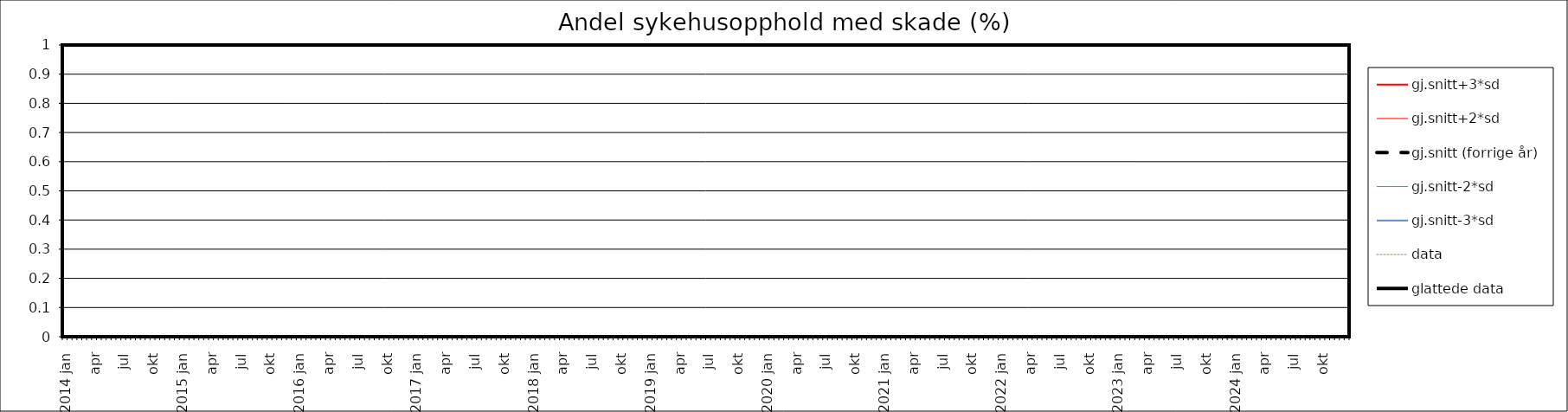
| Category | gj.snitt+3*sd | gj.snitt+2*sd | gj.snitt (forrige år) | gj.snitt-2*sd | gj.snitt-3*sd | data | glattede data |
|---|---|---|---|---|---|---|---|
| 2014 jan | 0 | 0 | 0 | 0 | 0 | 0 | 0 |
|  | 0 | 0 | 0 | 0 | 0 | 0 | 0 |
| feb | 0 | 0 | 0 | 0 | 0 | 0 | 0 |
|  | 0 | 0 | 0 | 0 | 0 | 0 | 0 |
| mar | 0 | 0 | 0 | 0 | 0 | 0 | 0 |
|  | 0 | 0 | 0 | 0 | 0 | 0 | 0 |
| apr | 0 | 0 | 0 | 0 | 0 | 0 | 0 |
|  | 0 | 0 | 0 | 0 | 0 | 0 | 0 |
| mai | 0 | 0 | 0 | 0 | 0 | 0 | 0 |
|  | 0 | 0 | 0 | 0 | 0 | 0 | 0 |
| jun | 0 | 0 | 0 | 0 | 0 | 0 | 0 |
|  | 0 | 0 | 0 | 0 | 0 | 0 | 0 |
| jul | 0 | 0 | 0 | 0 | 0 | 0 | 0 |
|  | 0 | 0 | 0 | 0 | 0 | 0 | 0 |
| aug | 0 | 0 | 0 | 0 | 0 | 0 | 0 |
|  | 0 | 0 | 0 | 0 | 0 | 0 | 0 |
| sep | 0 | 0 | 0 | 0 | 0 | 0 | 0 |
|  | 0 | 0 | 0 | 0 | 0 | 0 | 0 |
| okt | 0 | 0 | 0 | 0 | 0 | 0 | 0 |
|  | 0 | 0 | 0 | 0 | 0 | 0 | 0 |
| nov | 0 | 0 | 0 | 0 | 0 | 0 | 0 |
|  | 0 | 0 | 0 | 0 | 0 | 0 | 0 |
| des | 0 | 0 | 0 | 0 | 0 | 0 | 0 |
|  | 0 | 0 | 0 | 0 | 0 | 0 | 0 |
| 2015 jan | 0 | 0 | 0 | 0 | 0 | 0 | 0 |
|  | 0 | 0 | 0 | 0 | 0 | 0 | 0 |
| feb | 0 | 0 | 0 | 0 | 0 | 0 | 0 |
|  | 0 | 0 | 0 | 0 | 0 | 0 | 0 |
| mar | 0 | 0 | 0 | 0 | 0 | 0 | 0 |
|  | 0 | 0 | 0 | 0 | 0 | 0 | 0 |
| apr | 0 | 0 | 0 | 0 | 0 | 0 | 0 |
|  | 0 | 0 | 0 | 0 | 0 | 0 | 0 |
| mai | 0 | 0 | 0 | 0 | 0 | 0 | 0 |
|  | 0 | 0 | 0 | 0 | 0 | 0 | 0 |
| jun | 0 | 0 | 0 | 0 | 0 | 0 | 0 |
|  | 0 | 0 | 0 | 0 | 0 | 0 | 0 |
| jul | 0 | 0 | 0 | 0 | 0 | 0 | 0 |
|  | 0 | 0 | 0 | 0 | 0 | 0 | 0 |
| aug | 0 | 0 | 0 | 0 | 0 | 0 | 0 |
|  | 0 | 0 | 0 | 0 | 0 | 0 | 0 |
| sep | 0 | 0 | 0 | 0 | 0 | 0 | 0 |
|  | 0 | 0 | 0 | 0 | 0 | 0 | 0 |
| okt | 0 | 0 | 0 | 0 | 0 | 0 | 0 |
|  | 0 | 0 | 0 | 0 | 0 | 0 | 0 |
| nov | 0 | 0 | 0 | 0 | 0 | 0 | 0 |
|  | 0 | 0 | 0 | 0 | 0 | 0 | 0 |
| des | 0 | 0 | 0 | 0 | 0 | 0 | 0 |
|  | 0 | 0 | 0 | 0 | 0 | 0 | 0 |
| 2016 jan | 0 | 0 | 0 | 0 | 0 | 0 | 0 |
|  | 0 | 0 | 0 | 0 | 0 | 0 | 0 |
| feb | 0 | 0 | 0 | 0 | 0 | 0 | 0 |
|  | 0 | 0 | 0 | 0 | 0 | 0 | 0 |
| mar | 0 | 0 | 0 | 0 | 0 | 0 | 0 |
|  | 0 | 0 | 0 | 0 | 0 | 0 | 0 |
| apr | 0 | 0 | 0 | 0 | 0 | 0 | 0 |
|  | 0 | 0 | 0 | 0 | 0 | 0 | 0 |
| mai | 0 | 0 | 0 | 0 | 0 | 0 | 0 |
|  | 0 | 0 | 0 | 0 | 0 | 0 | 0 |
| jun | 0 | 0 | 0 | 0 | 0 | 0 | 0 |
|  | 0 | 0 | 0 | 0 | 0 | 0 | 0 |
| jul | 0 | 0 | 0 | 0 | 0 | 0 | 0 |
|  | 0 | 0 | 0 | 0 | 0 | 0 | 0 |
| aug | 0 | 0 | 0 | 0 | 0 | 0 | 0 |
|  | 0 | 0 | 0 | 0 | 0 | 0 | 0 |
| sep | 0 | 0 | 0 | 0 | 0 | 0 | 0 |
|  | 0 | 0 | 0 | 0 | 0 | 0 | 0 |
| okt | 0 | 0 | 0 | 0 | 0 | 0 | 0 |
|  | 0 | 0 | 0 | 0 | 0 | 0 | 0 |
| nov | 0 | 0 | 0 | 0 | 0 | 0 | 0 |
|  | 0 | 0 | 0 | 0 | 0 | 0 | 0 |
| des | 0 | 0 | 0 | 0 | 0 | 0 | 0 |
|  | 0 | 0 | 0 | 0 | 0 | 0 | 0 |
| 2017 jan | 0 | 0 | 0 | 0 | 0 | 0 | 0 |
|  | 0 | 0 | 0 | 0 | 0 | 0 | 0 |
| feb | 0 | 0 | 0 | 0 | 0 | 0 | 0 |
|  | 0 | 0 | 0 | 0 | 0 | 0 | 0 |
| mar | 0 | 0 | 0 | 0 | 0 | 0 | 0 |
|  | 0 | 0 | 0 | 0 | 0 | 0 | 0 |
| apr | 0 | 0 | 0 | 0 | 0 | 0 | 0 |
|  | 0 | 0 | 0 | 0 | 0 | 0 | 0 |
| mai | 0 | 0 | 0 | 0 | 0 | 0 | 0 |
|  | 0 | 0 | 0 | 0 | 0 | 0 | 0 |
| jun | 0 | 0 | 0 | 0 | 0 | 0 | 0 |
|  | 0 | 0 | 0 | 0 | 0 | 0 | 0 |
| jul | 0 | 0 | 0 | 0 | 0 | 0 | 0 |
|  | 0 | 0 | 0 | 0 | 0 | 0 | 0 |
| aug | 0 | 0 | 0 | 0 | 0 | 0 | 0 |
|  | 0 | 0 | 0 | 0 | 0 | 0 | 0 |
| sep | 0 | 0 | 0 | 0 | 0 | 0 | 0 |
|  | 0 | 0 | 0 | 0 | 0 | 0 | 0 |
| okt | 0 | 0 | 0 | 0 | 0 | 0 | 0 |
|  | 0 | 0 | 0 | 0 | 0 | 0 | 0 |
| nov | 0 | 0 | 0 | 0 | 0 | 0 | 0 |
|  | 0 | 0 | 0 | 0 | 0 | 0 | 0 |
| des | 0 | 0 | 0 | 0 | 0 | 0 | 0 |
|  | 0 | 0 | 0 | 0 | 0 | 0 | 0 |
| 2018 jan | 0 | 0 | 0 | 0 | 0 | 0 | 0 |
|  | 0 | 0 | 0 | 0 | 0 | 0 | 0 |
| feb | 0 | 0 | 0 | 0 | 0 | 0 | 0 |
|  | 0 | 0 | 0 | 0 | 0 | 0 | 0 |
| mar | 0 | 0 | 0 | 0 | 0 | 0 | 0 |
|  | 0 | 0 | 0 | 0 | 0 | 0 | 0 |
| apr | 0 | 0 | 0 | 0 | 0 | 0 | 0 |
|  | 0 | 0 | 0 | 0 | 0 | 0 | 0 |
| mai | 0 | 0 | 0 | 0 | 0 | 0 | 0 |
|  | 0 | 0 | 0 | 0 | 0 | 0 | 0 |
| jun | 0 | 0 | 0 | 0 | 0 | 0 | 0 |
|  | 0 | 0 | 0 | 0 | 0 | 0 | 0 |
| jul | 0 | 0 | 0 | 0 | 0 | 0 | 0 |
|  | 0 | 0 | 0 | 0 | 0 | 0 | 0 |
| aug | 0 | 0 | 0 | 0 | 0 | 0 | 0 |
|  | 0 | 0 | 0 | 0 | 0 | 0 | 0 |
| sep | 0 | 0 | 0 | 0 | 0 | 0 | 0 |
|  | 0 | 0 | 0 | 0 | 0 | 0 | 0 |
| okt | 0 | 0 | 0 | 0 | 0 | 0 | 0 |
|  | 0 | 0 | 0 | 0 | 0 | 0 | 0 |
| nov | 0 | 0 | 0 | 0 | 0 | 0 | 0 |
|  | 0 | 0 | 0 | 0 | 0 | 0 | 0 |
| des | 0 | 0 | 0 | 0 | 0 | 0 | 0 |
|  | 0 | 0 | 0 | 0 | 0 | 0 | 0 |
| 2019 jan | 0 | 0 | 0 | 0 | 0 | 0 | 0 |
|  | 0 | 0 | 0 | 0 | 0 | 0 | 0 |
| feb | 0 | 0 | 0 | 0 | 0 | 0 | 0 |
|  | 0 | 0 | 0 | 0 | 0 | 0 | 0 |
| mar | 0 | 0 | 0 | 0 | 0 | 0 | 0 |
|  | 0 | 0 | 0 | 0 | 0 | 0 | 0 |
| apr | 0 | 0 | 0 | 0 | 0 | 0 | 0 |
|  | 0 | 0 | 0 | 0 | 0 | 0 | 0 |
| mai | 0 | 0 | 0 | 0 | 0 | 0 | 0 |
|  | 0 | 0 | 0 | 0 | 0 | 0 | 0 |
| jun | 0 | 0 | 0 | 0 | 0 | 0 | 0 |
|  | 0 | 0 | 0 | 0 | 0 | 0 | 0 |
| jul | 0 | 0 | 0 | 0 | 0 | 0 | 0 |
|  | 0 | 0 | 0 | 0 | 0 | 0 | 0 |
| aug | 0 | 0 | 0 | 0 | 0 | 0 | 0 |
|  | 0 | 0 | 0 | 0 | 0 | 0 | 0 |
| sep | 0 | 0 | 0 | 0 | 0 | 0 | 0 |
|  | 0 | 0 | 0 | 0 | 0 | 0 | 0 |
| okt | 0 | 0 | 0 | 0 | 0 | 0 | 0 |
|  | 0 | 0 | 0 | 0 | 0 | 0 | 0 |
| nov | 0 | 0 | 0 | 0 | 0 | 0 | 0 |
|  | 0 | 0 | 0 | 0 | 0 | 0 | 0 |
| des | 0 | 0 | 0 | 0 | 0 | 0 | 0 |
|  | 0 | 0 | 0 | 0 | 0 | 0 | 0 |
| 2020 jan | 0 | 0 | 0 | 0 | 0 | 0 | 0 |
|  | 0 | 0 | 0 | 0 | 0 | 0 | 0 |
| feb | 0 | 0 | 0 | 0 | 0 | 0 | 0 |
|  | 0 | 0 | 0 | 0 | 0 | 0 | 0 |
| mar | 0 | 0 | 0 | 0 | 0 | 0 | 0 |
|  | 0 | 0 | 0 | 0 | 0 | 0 | 0 |
| apr | 0 | 0 | 0 | 0 | 0 | 0 | 0 |
|  | 0 | 0 | 0 | 0 | 0 | 0 | 0 |
| mai | 0 | 0 | 0 | 0 | 0 | 0 | 0 |
|  | 0 | 0 | 0 | 0 | 0 | 0 | 0 |
| jun | 0 | 0 | 0 | 0 | 0 | 0 | 0 |
|  | 0 | 0 | 0 | 0 | 0 | 0 | 0 |
| jul | 0 | 0 | 0 | 0 | 0 | 0 | 0 |
|  | 0 | 0 | 0 | 0 | 0 | 0 | 0 |
| aug | 0 | 0 | 0 | 0 | 0 | 0 | 0 |
|  | 0 | 0 | 0 | 0 | 0 | 0 | 0 |
| sep | 0 | 0 | 0 | 0 | 0 | 0 | 0 |
|  | 0 | 0 | 0 | 0 | 0 | 0 | 0 |
| okt | 0 | 0 | 0 | 0 | 0 | 0 | 0 |
|  | 0 | 0 | 0 | 0 | 0 | 0 | 0 |
| nov | 0 | 0 | 0 | 0 | 0 | 0 | 0 |
|  | 0 | 0 | 0 | 0 | 0 | 0 | 0 |
| des | 0 | 0 | 0 | 0 | 0 | 0 | 0 |
|  | 0 | 0 | 0 | 0 | 0 | 0 | 0 |
| 2021 jan | 0 | 0 | 0 | 0 | 0 | 0 | 0 |
|  | 0 | 0 | 0 | 0 | 0 | 0 | 0 |
| feb | 0 | 0 | 0 | 0 | 0 | 0 | 0 |
|  | 0 | 0 | 0 | 0 | 0 | 0 | 0 |
| mar | 0 | 0 | 0 | 0 | 0 | 0 | 0 |
|  | 0 | 0 | 0 | 0 | 0 | 0 | 0 |
| apr | 0 | 0 | 0 | 0 | 0 | 0 | 0 |
|  | 0 | 0 | 0 | 0 | 0 | 0 | 0 |
| mai | 0 | 0 | 0 | 0 | 0 | 0 | 0 |
|  | 0 | 0 | 0 | 0 | 0 | 0 | 0 |
| jun | 0 | 0 | 0 | 0 | 0 | 0 | 0 |
|  | 0 | 0 | 0 | 0 | 0 | 0 | 0 |
| jul | 0 | 0 | 0 | 0 | 0 | 0 | 0 |
|  | 0 | 0 | 0 | 0 | 0 | 0 | 0 |
| aug | 0 | 0 | 0 | 0 | 0 | 0 | 0 |
|  | 0 | 0 | 0 | 0 | 0 | 0 | 0 |
| sep | 0 | 0 | 0 | 0 | 0 | 0 | 0 |
|  | 0 | 0 | 0 | 0 | 0 | 0 | 0 |
| okt | 0 | 0 | 0 | 0 | 0 | 0 | 0 |
|  | 0 | 0 | 0 | 0 | 0 | 0 | 0 |
| nov | 0 | 0 | 0 | 0 | 0 | 0 | 0 |
|  | 0 | 0 | 0 | 0 | 0 | 0 | 0 |
| des | 0 | 0 | 0 | 0 | 0 | 0 | 0 |
|  | 0 | 0 | 0 | 0 | 0 | 0 | 0 |
| 2022 jan | 0 | 0 | 0 | 0 | 0 | 0 | 0 |
|  | 0 | 0 | 0 | 0 | 0 | 0 | 0 |
| feb | 0 | 0 | 0 | 0 | 0 | 0 | 0 |
|  | 0 | 0 | 0 | 0 | 0 | 0 | 0 |
| mar | 0 | 0 | 0 | 0 | 0 | 0 | 0 |
|  | 0 | 0 | 0 | 0 | 0 | 0 | 0 |
| apr | 0 | 0 | 0 | 0 | 0 | 0 | 0 |
|  | 0 | 0 | 0 | 0 | 0 | 0 | 0 |
| mai | 0 | 0 | 0 | 0 | 0 | 0 | 0 |
|  | 0 | 0 | 0 | 0 | 0 | 0 | 0 |
| jun | 0 | 0 | 0 | 0 | 0 | 0 | 0 |
|  | 0 | 0 | 0 | 0 | 0 | 0 | 0 |
| jul | 0 | 0 | 0 | 0 | 0 | 0 | 0 |
|  | 0 | 0 | 0 | 0 | 0 | 0 | 0 |
| aug | 0 | 0 | 0 | 0 | 0 | 0 | 0 |
|  | 0 | 0 | 0 | 0 | 0 | 0 | 0 |
| sep | 0 | 0 | 0 | 0 | 0 | 0 | 0 |
|  | 0 | 0 | 0 | 0 | 0 | 0 | 0 |
| okt | 0 | 0 | 0 | 0 | 0 | 0 | 0 |
|  | 0 | 0 | 0 | 0 | 0 | 0 | 0 |
| nov | 0 | 0 | 0 | 0 | 0 | 0 | 0 |
|  | 0 | 0 | 0 | 0 | 0 | 0 | 0 |
| des | 0 | 0 | 0 | 0 | 0 | 0 | 0 |
|  | 0 | 0 | 0 | 0 | 0 | 0 | 0 |
| 2023 jan | 0 | 0 | 0 | 0 | 0 | 0 | 0 |
|  | 0 | 0 | 0 | 0 | 0 | 0 | 0 |
| feb | 0 | 0 | 0 | 0 | 0 | 0 | 0 |
|  | 0 | 0 | 0 | 0 | 0 | 0 | 0 |
| mar | 0 | 0 | 0 | 0 | 0 | 0 | 0 |
|  | 0 | 0 | 0 | 0 | 0 | 0 | 0 |
| apr | 0 | 0 | 0 | 0 | 0 | 0 | 0 |
|  | 0 | 0 | 0 | 0 | 0 | 0 | 0 |
| mai | 0 | 0 | 0 | 0 | 0 | 0 | 0 |
|  | 0 | 0 | 0 | 0 | 0 | 0 | 0 |
| jun | 0 | 0 | 0 | 0 | 0 | 0 | 0 |
|  | 0 | 0 | 0 | 0 | 0 | 0 | 0 |
| jul | 0 | 0 | 0 | 0 | 0 | 0 | 0 |
|  | 0 | 0 | 0 | 0 | 0 | 0 | 0 |
| aug | 0 | 0 | 0 | 0 | 0 | 0 | 0 |
|  | 0 | 0 | 0 | 0 | 0 | 0 | 0 |
| sep | 0 | 0 | 0 | 0 | 0 | 0 | 0 |
|  | 0 | 0 | 0 | 0 | 0 | 0 | 0 |
| okt | 0 | 0 | 0 | 0 | 0 | 0 | 0 |
|  | 0 | 0 | 0 | 0 | 0 | 0 | 0 |
| nov | 0 | 0 | 0 | 0 | 0 | 0 | 0 |
|  | 0 | 0 | 0 | 0 | 0 | 0 | 0 |
| des | 0 | 0 | 0 | 0 | 0 | 0 | 0 |
|  | 0 | 0 | 0 | 0 | 0 | 0 | 0 |
| 2024 jan | 0 | 0 | 0 | 0 | 0 | 0 | 0 |
|  | 0 | 0 | 0 | 0 | 0 | 0 | 0 |
| feb | 0 | 0 | 0 | 0 | 0 | 0 | 0 |
|  | 0 | 0 | 0 | 0 | 0 | 0 | 0 |
| mar | 0 | 0 | 0 | 0 | 0 | 0 | 0 |
|  | 0 | 0 | 0 | 0 | 0 | 0 | 0 |
| apr | 0 | 0 | 0 | 0 | 0 | 0 | 0 |
|  | 0 | 0 | 0 | 0 | 0 | 0 | 0 |
| mai | 0 | 0 | 0 | 0 | 0 | 0 | 0 |
|  | 0 | 0 | 0 | 0 | 0 | 0 | 0 |
| jun | 0 | 0 | 0 | 0 | 0 | 0 | 0 |
|  | 0 | 0 | 0 | 0 | 0 | 0 | 0 |
| jul | 0 | 0 | 0 | 0 | 0 | 0 | 0 |
|  | 0 | 0 | 0 | 0 | 0 | 0 | 0 |
| aug | 0 | 0 | 0 | 0 | 0 | 0 | 0 |
|  | 0 | 0 | 0 | 0 | 0 | 0 | 0 |
| sep | 0 | 0 | 0 | 0 | 0 | 0 | 0 |
|  | 0 | 0 | 0 | 0 | 0 | 0 | 0 |
| okt | 0 | 0 | 0 | 0 | 0 | 0 | 0 |
|  | 0 | 0 | 0 | 0 | 0 | 0 | 0 |
| nov | 0 | 0 | 0 | 0 | 0 | 0 | 0 |
|  | 0 | 0 | 0 | 0 | 0 | 0 | 0 |
| des | 0 | 0 | 0 | 0 | 0 | 0 | 0 |